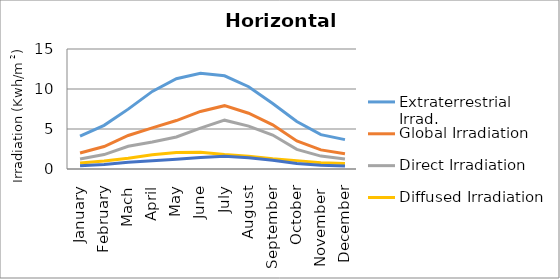
| Category | Extraterrestrial Irrad. | Global Irradiation | Direct Irradiation | Diffused Irradiation | Reflected Irradiation |
|---|---|---|---|---|---|
| January | 4.099 | 2 | 1.242 | 0.758 | 0.4 |
| February | 5.457 | 2.806 | 1.804 | 1.002 | 0.561 |
| Mach | 7.483 | 4.194 | 2.849 | 1.346 | 0.839 |
| April | 9.7 | 5.139 | 3.368 | 1.771 | 1.028 |
| May | 11.288 | 6.056 | 4 | 2.055 | 1.211 |
| June | 11.966 | 7.194 | 5.107 | 2.087 | 1.439 |
| July | 11.647 | 7.917 | 6.104 | 1.813 | 1.583 |
| August | 10.284 | 6.972 | 5.366 | 1.607 | 1.394 |
| September | 8.19 | 5.528 | 4.24 | 1.288 | 1.106 |
| October | 5.94 | 3.5 | 2.453 | 1.047 | 0.7 |
| November  | 4.3 | 2.389 | 1.613 | 0.776 | 0.478 |
| December | 3.675 | 1.917 | 1.244 | 0.673 | 0.383 |